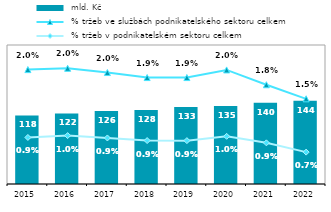
| Category |  mld. Kč  |
|---|---|
| 2015.0 | 118.336 |
| 2016.0 | 121.884 |
| 2017.0 | 125.872 |
| 2018.0 | 127.568 |
| 2019.0 | 132.752 |
| 2020.0 | 134.726 |
| 2021.0 | 140.288 |
| 2022.0 | 143.838 |